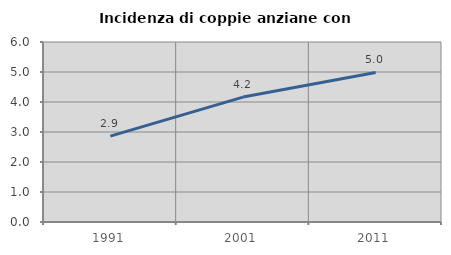
| Category | Incidenza di coppie anziane con figli |
|---|---|
| 1991.0 | 2.862 |
| 2001.0 | 4.163 |
| 2011.0 | 4.986 |